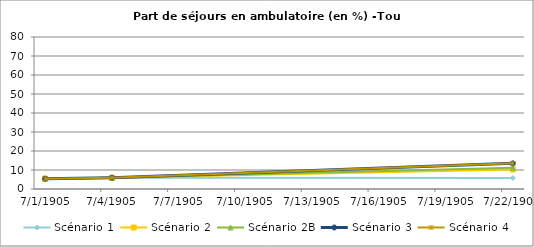
| Category | Scénario 1 | Scénario 2 | Scénario 2B | Scénario 3 | Scénario 4 |
|---|---|---|---|---|---|
| 2009.0 | 5.446 | 5.446 | 5.446 | 5.446 | 5.446 |
| 2012.0 | 5.929 | 5.929 | 5.929 | 5.929 | 5.929 |
| 2030.0 | 5.739 | 10.277 | 11.203 | 13.493 | 13.493 |